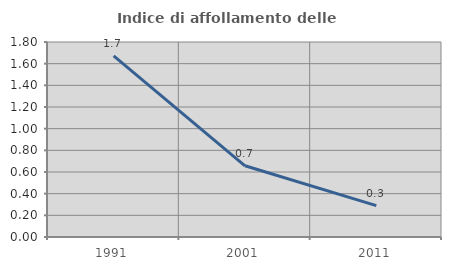
| Category | Indice di affollamento delle abitazioni  |
|---|---|
| 1991.0 | 1.673 |
| 2001.0 | 0.657 |
| 2011.0 | 0.289 |